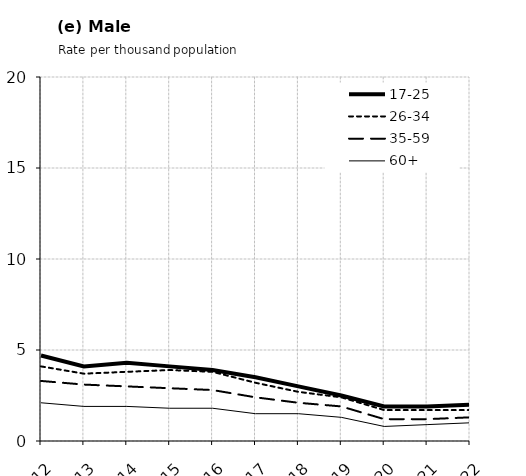
| Category | 17-25 | 26-34 | 35-59 | 60+ |
|---|---|---|---|---|
| 2012.0 | 4.7 | 4.1 | 3.3 | 2.1 |
| 2013.0 | 4.1 | 3.7 | 3.1 | 1.9 |
| 2014.0 | 4.3 | 3.8 | 3 | 1.9 |
| 2015.0 | 4.1 | 3.9 | 2.9 | 1.8 |
| 2016.0 | 3.9 | 3.8 | 2.8 | 1.8 |
| 2017.0 | 3.5 | 3.2 | 2.4 | 1.5 |
| 2018.0 | 3 | 2.7 | 2.1 | 1.5 |
| 2019.0 | 2.5 | 2.4 | 1.9 | 1.3 |
| 2020.0 | 1.9 | 1.7 | 1.2 | 0.8 |
| 2021.0 | 1.9 | 1.7 | 1.2 | 0.9 |
| 2022.0 | 2 | 1.7 | 1.3 | 1 |